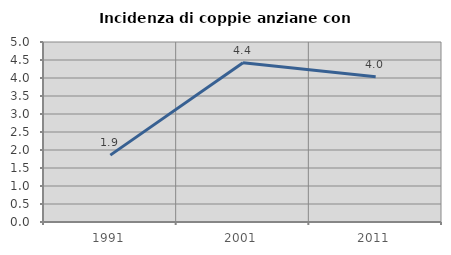
| Category | Incidenza di coppie anziane con figli |
|---|---|
| 1991.0 | 1.858 |
| 2001.0 | 4.423 |
| 2011.0 | 4.034 |